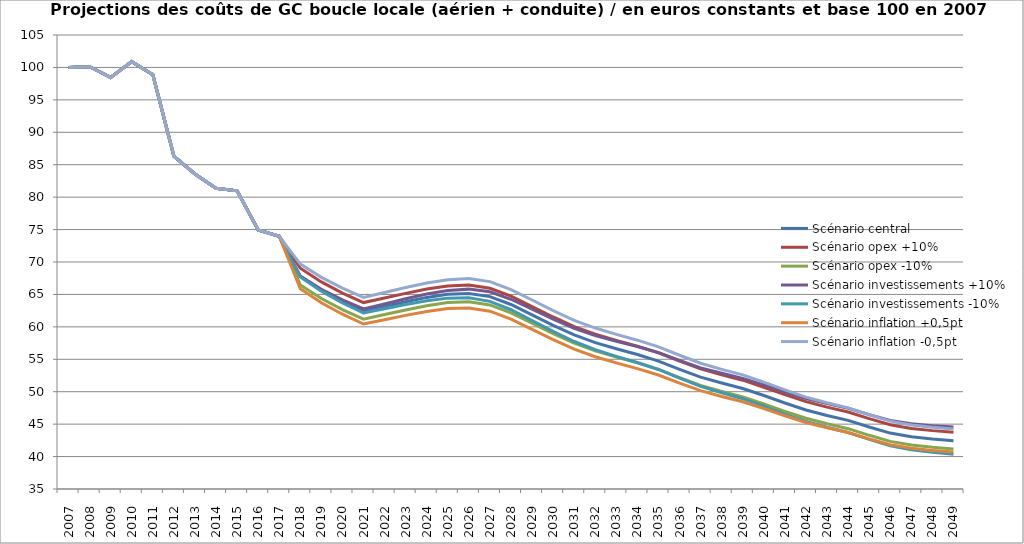
| Category | Scénario central | Scénario opex +10% | Scénario opex -10% | Scénario investissements +10% | Scénario investissements -10% | Scénario inflation +0,5pt | Scénario inflation -0,5pt |
|---|---|---|---|---|---|---|---|
| 2007.0 | 100 | 100 | 100 | 100 | 100 | 100 | 100 |
| 2008.0 | 100.119 | 100.119 | 100.119 | 100.119 | 100.119 | 100.119 | 100.119 |
| 2009.0 | 98.456 | 98.456 | 98.456 | 98.456 | 98.456 | 98.456 | 98.456 |
| 2010.0 | 100.889 | 100.889 | 100.889 | 100.889 | 100.889 | 100.889 | 100.889 |
| 2011.0 | 98.88 | 98.88 | 98.88 | 98.88 | 98.88 | 98.88 | 98.88 |
| 2012.0 | 86.322 | 86.322 | 86.322 | 86.322 | 86.322 | 86.322 | 86.322 |
| 2013.0 | 83.577 | 83.577 | 83.577 | 83.577 | 83.577 | 83.577 | 83.577 |
| 2014.0 | 81.375 | 81.375 | 81.375 | 81.375 | 81.375 | 81.375 | 81.375 |
| 2015.0 | 80.973 | 80.973 | 80.973 | 80.973 | 80.973 | 80.973 | 80.973 |
| 2016.0 | 74.935 | 74.935 | 74.935 | 74.935 | 74.935 | 74.935 | 74.935 |
| 2017.0 | 73.969 | 73.969 | 73.969 | 73.969 | 73.969 | 73.969 | 73.969 |
| 2018.0 | 67.752 | 69.034 | 66.471 | 67.828 | 67.676 | 65.88 | 69.669 |
| 2019.0 | 65.652 | 66.934 | 64.371 | 65.803 | 65.501 | 63.722 | 67.629 |
| 2020.0 | 63.93 | 65.211 | 62.649 | 64.156 | 63.704 | 61.947 | 65.962 |
| 2021.0 | 62.465 | 63.746 | 61.183 | 62.764 | 62.165 | 60.433 | 64.548 |
| 2022.0 | 63.175 | 64.456 | 61.893 | 63.548 | 62.801 | 61.1 | 65.302 |
| 2023.0 | 63.884 | 65.166 | 62.603 | 64.331 | 63.438 | 61.767 | 66.056 |
| 2024.0 | 64.543 | 65.824 | 63.261 | 65.062 | 64.023 | 62.383 | 66.758 |
| 2025.0 | 65.021 | 66.303 | 63.74 | 65.613 | 64.429 | 62.823 | 67.276 |
| 2026.0 | 65.153 | 66.434 | 63.872 | 65.817 | 64.489 | 62.922 | 67.44 |
| 2027.0 | 64.666 | 65.948 | 63.385 | 65.402 | 63.93 | 62.418 | 66.972 |
| 2028.0 | 63.447 | 64.728 | 62.166 | 64.254 | 62.64 | 61.199 | 65.752 |
| 2029.0 | 61.849 | 63.131 | 60.568 | 62.727 | 60.971 | 59.615 | 64.141 |
| 2030.0 | 60.242 | 61.523 | 58.96 | 61.191 | 59.293 | 58.026 | 62.515 |
| 2031.0 | 58.759 | 60.041 | 57.478 | 59.778 | 57.74 | 56.562 | 61.013 |
| 2032.0 | 57.576 | 58.858 | 56.295 | 58.665 | 56.487 | 55.393 | 59.815 |
| 2033.0 | 56.618 | 57.899 | 55.336 | 57.776 | 55.459 | 54.445 | 58.846 |
| 2034.0 | 55.728 | 57.01 | 54.447 | 56.956 | 54.5 | 53.566 | 57.946 |
| 2035.0 | 54.725 | 56.007 | 53.444 | 56.022 | 53.429 | 52.581 | 56.925 |
| 2036.0 | 53.453 | 54.734 | 52.172 | 54.818 | 52.088 | 51.339 | 55.622 |
| 2037.0 | 52.247 | 53.529 | 50.966 | 53.681 | 50.814 | 50.163 | 54.385 |
| 2038.0 | 51.335 | 52.616 | 50.054 | 52.837 | 49.834 | 49.272 | 53.451 |
| 2039.0 | 50.495 | 51.776 | 49.214 | 52.064 | 48.926 | 48.453 | 52.589 |
| 2040.0 | 49.414 | 50.695 | 48.133 | 51.051 | 47.777 | 47.405 | 51.474 |
| 2041.0 | 48.259 | 49.54 | 46.978 | 49.963 | 46.555 | 46.289 | 50.279 |
| 2042.0 | 47.188 | 48.469 | 45.906 | 48.958 | 45.417 | 45.255 | 49.169 |
| 2043.0 | 46.344 | 47.625 | 45.063 | 48.161 | 44.528 | 44.44 | 48.296 |
| 2044.0 | 45.58 | 46.862 | 44.299 | 47.443 | 43.718 | 43.703 | 47.505 |
| 2045.0 | 44.56 | 45.841 | 43.279 | 46.469 | 42.651 | 42.723 | 46.442 |
| 2046.0 | 43.624 | 44.905 | 42.342 | 45.579 | 41.668 | 41.825 | 45.467 |
| 2047.0 | 43.063 | 44.344 | 41.781 | 45.064 | 41.061 | 41.285 | 44.884 |
| 2048.0 | 42.719 | 44.001 | 41.438 | 44.767 | 40.671 | 40.952 | 44.53 |
| 2049.0 | 42.45 | 43.732 | 41.169 | 44.545 | 40.356 | 40.691 | 44.253 |